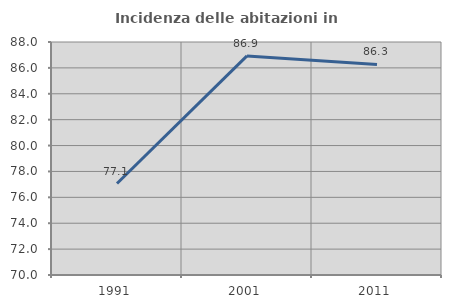
| Category | Incidenza delle abitazioni in proprietà  |
|---|---|
| 1991.0 | 77.068 |
| 2001.0 | 86.923 |
| 2011.0 | 86.266 |